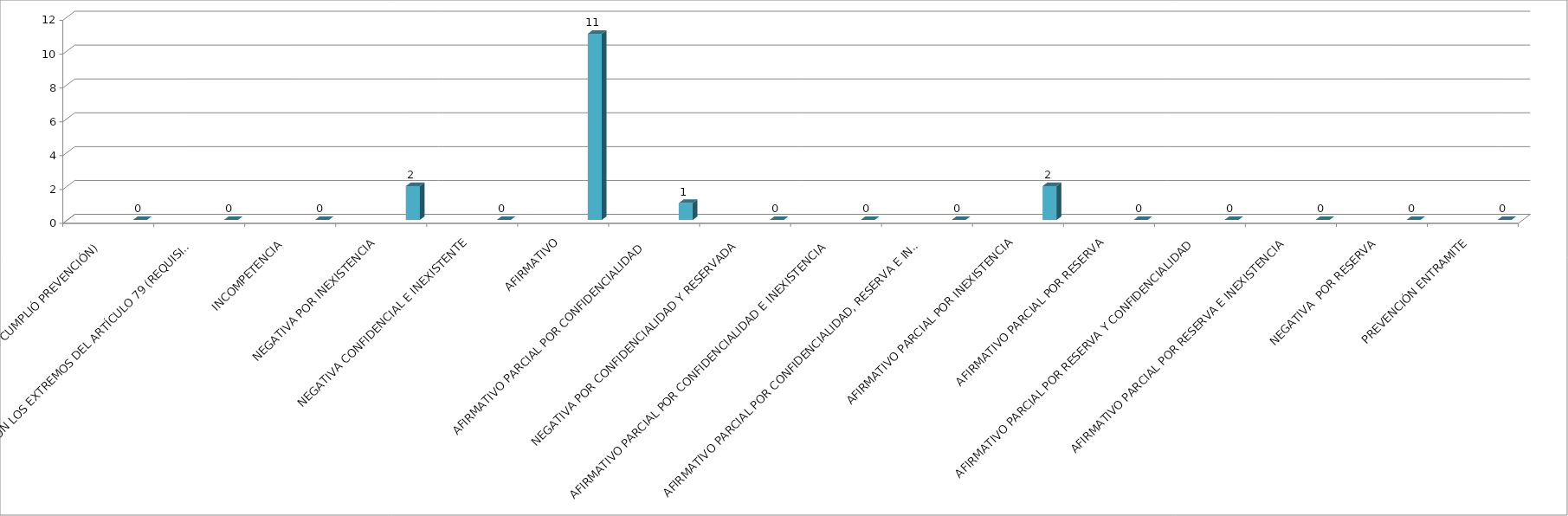
| Category | Series 0 | Series 1 | Series 2 | Series 3 | Series 4 |
|---|---|---|---|---|---|
| SE TIENE POR NO PRESENTADA ( NO CUMPLIÓ PREVENCIÓN) |  |  |  |  | 0 |
| NO CUMPLIO CON LOS EXTREMOS DEL ARTÍCULO 79 (REQUISITOS) |  |  |  |  | 0 |
| INCOMPETENCIA  |  |  |  |  | 0 |
| NEGATIVA POR INEXISTENCIA |  |  |  |  | 2 |
| NEGATIVA CONFIDENCIAL E INEXISTENTE |  |  |  |  | 0 |
| AFIRMATIVO |  |  |  |  | 11 |
| AFIRMATIVO PARCIAL POR CONFIDENCIALIDAD  |  |  |  |  | 1 |
| NEGATIVA POR CONFIDENCIALIDAD Y RESERVADA |  |  |  |  | 0 |
| AFIRMATIVO PARCIAL POR CONFIDENCIALIDAD E INEXISTENCIA |  |  |  |  | 0 |
| AFIRMATIVO PARCIAL POR CONFIDENCIALIDAD, RESERVA E INEXISTENCIA |  |  |  |  | 0 |
| AFIRMATIVO PARCIAL POR INEXISTENCIA |  |  |  |  | 2 |
| AFIRMATIVO PARCIAL POR RESERVA |  |  |  |  | 0 |
| AFIRMATIVO PARCIAL POR RESERVA Y CONFIDENCIALIDAD |  |  |  |  | 0 |
| AFIRMATIVO PARCIAL POR RESERVA E INEXISTENCIA |  |  |  |  | 0 |
| NEGATIVA  POR RESERVA |  |  |  |  | 0 |
| PREVENCIÓN ENTRAMITE |  |  |  |  | 0 |